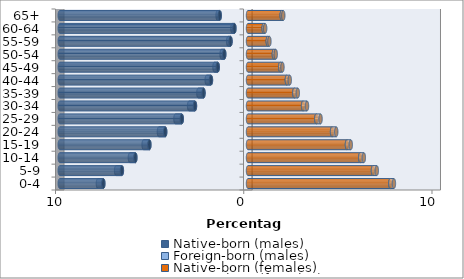
| Category | Native-born (males) | Foreign-born (males) | Native-born (females) | Foreign-born (females) |
|---|---|---|---|---|
| 0-4 | -7.686 | -0.287 | 7.562 | 0.19 |
| 5-9 | -6.7 | -0.306 | 6.639 | 0.203 |
| 10-14 | -5.984 | -0.289 | 5.962 | 0.192 |
| 15-19 | -5.24 | -0.305 | 5.257 | 0.203 |
| 20-24 | -4.399 | -0.333 | 4.466 | 0.222 |
| 25-29 | -3.518 | -0.336 | 3.628 | 0.225 |
| 30-34 | -2.818 | -0.312 | 2.925 | 0.209 |
| 35-39 | -2.365 | -0.273 | 2.462 | 0.184 |
| 40-44 | -1.968 | -0.225 | 2.064 | 0.153 |
| 45-49 | -1.608 | -0.174 | 1.711 | 0.119 |
| 50-54 | -1.262 | -0.141 | 1.375 | 0.098 |
| 55-59 | -0.929 | -0.124 | 1.051 | 0.087 |
| 60-64 | -0.722 | -0.109 | 0.833 | 0.078 |
| 65+ | -1.503 | -0.113 | 1.791 | 0.083 |